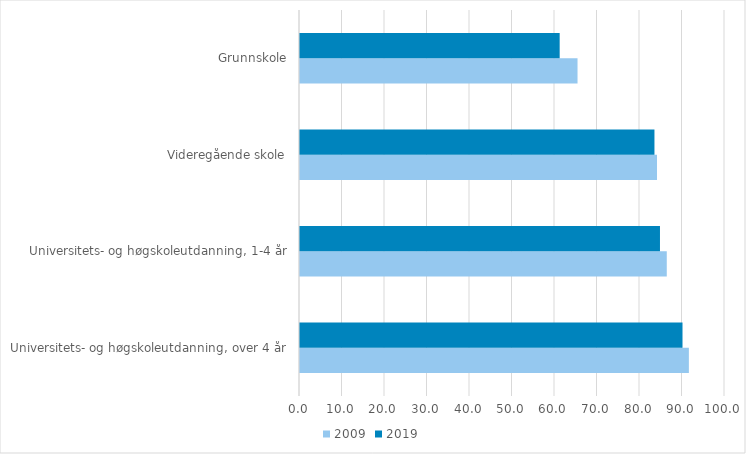
| Category | 2009 | 2019 |
|---|---|---|
| Universitets- og høgskoleutdanning, over 4 år | 91.5 | 90 |
| Universitets- og høgskoleutdanning, 1-4 år | 86.3 | 84.7 |
| Videregående skole | 84 | 83.4 |
| Grunnskole | 65.3 | 61.1 |